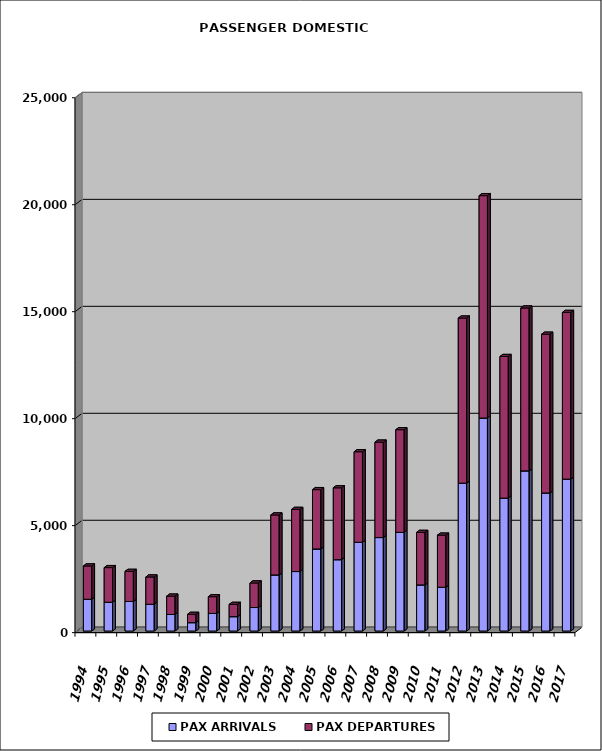
| Category | PAX ARRIVALS | PAX DEPARTURES |
|---|---|---|
| 1994.0 | 1485 | 1555 |
| 1995.0 | 1344 | 1619 |
| 1996.0 | 1380 | 1407 |
| 1997.0 | 1250 | 1276 |
| 1998.0 | 773 | 858 |
| 1999.0 | 391 | 387 |
| 2000.0 | 822 | 782 |
| 2001.0 | 671 | 574 |
| 2002.0 | 1098 | 1149 |
| 2003.0 | 2621 | 2804 |
| 2004.0 | 2780 | 2904 |
| 2005.0 | 3835 | 2773 |
| 2006.0 | 3334 | 3359 |
| 2007.0 | 4147 | 4232 |
| 2008.0 | 4368 | 4460 |
| 2009.0 | 4611 | 4799 |
| 2010.0 | 2154 | 2455 |
| 2011.0 | 2045 | 2435 |
| 2012.0 | 6910 | 7717 |
| 2013.0 | 9955 | 10394 |
| 2014.0 | 6211 | 6620 |
| 2015.0 | 7485 | 7612 |
| 2016.0 | 6452 | 7420 |
| 2017.0 | 7098 | 7793 |